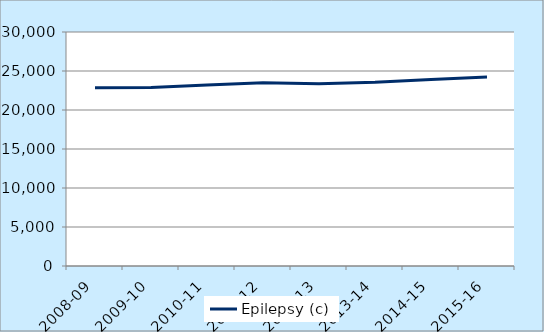
| Category | Epilepsy (c) |
|---|---|
| 2008-09 | 22842 |
| 2009-10 | 22885 |
| 2010-11 | 23194 |
| 2011-12 | 23479 |
| 2012-13 | 23373 |
| 2013-14 | 23545 |
| 2014-15 | 23896 |
| 2015-16 | 24226 |